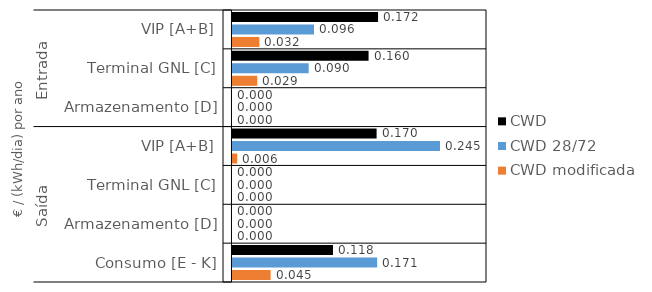
| Category | CWD | CWD 28/72 | CWD modificada |
|---|---|---|---|
| 0 | 0.172 | 0.096 | 0.032 |
| 1 | 0.16 | 0.09 | 0.029 |
| 2 | 0 | 0 | 0 |
| 3 | 0.17 | 0.245 | 0.006 |
| 4 | 0 | 0 | 0 |
| 5 | 0 | 0 | 0 |
| 6 | 0.118 | 0.171 | 0.045 |